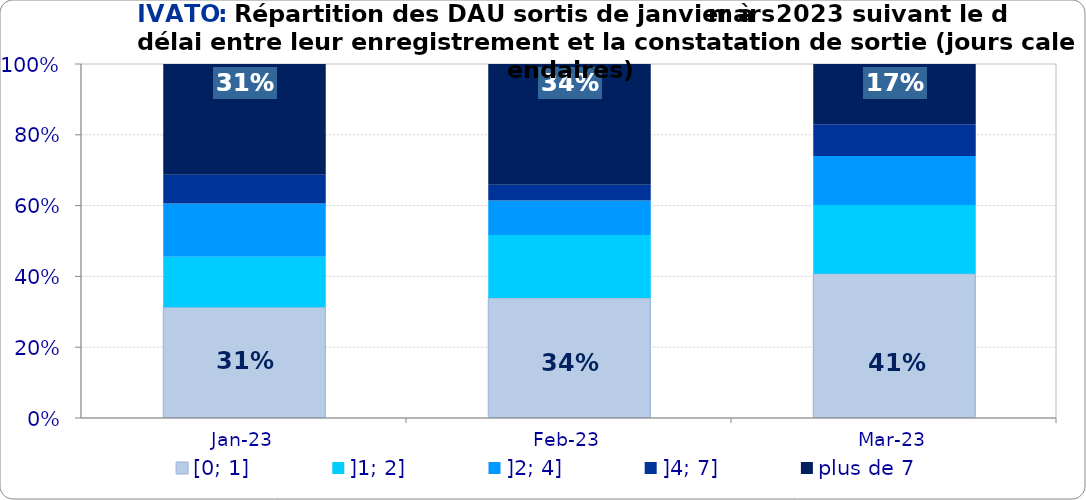
| Category | [0; 1] | ]1; 2] | ]2; 4] | ]4; 7] | plus de 7 |
|---|---|---|---|---|---|
| 2023-01-01 | 0.313 | 0.142 | 0.151 | 0.081 | 0.313 |
| 2023-02-01 | 0.339 | 0.178 | 0.097 | 0.045 | 0.341 |
| 2023-03-01 | 0.408 | 0.194 | 0.139 | 0.09 | 0.17 |